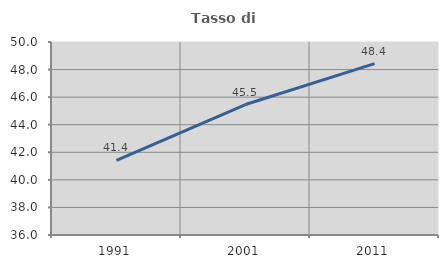
| Category | Tasso di occupazione   |
|---|---|
| 1991.0 | 41.408 |
| 2001.0 | 45.466 |
| 2011.0 | 48.434 |